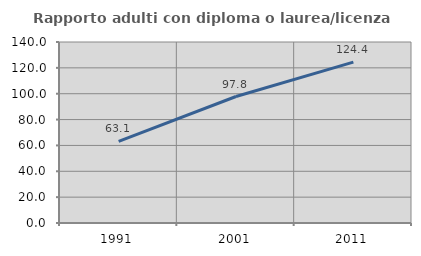
| Category | Rapporto adulti con diploma o laurea/licenza media  |
|---|---|
| 1991.0 | 63.142 |
| 2001.0 | 97.835 |
| 2011.0 | 124.43 |